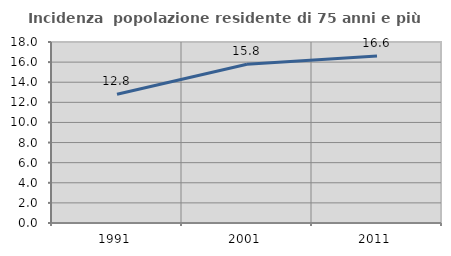
| Category | Incidenza  popolazione residente di 75 anni e più |
|---|---|
| 1991.0 | 12.798 |
| 2001.0 | 15.793 |
| 2011.0 | 16.617 |